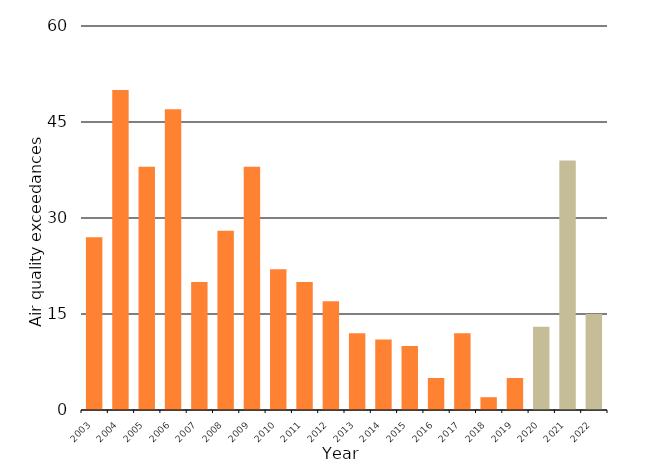
| Category | Air quality exceedances |
|---|---|
| 2003.0 | 27 |
| 2004.0 | 50 |
| 2005.0 | 38 |
| 2006.0 | 47 |
| 2007.0 | 20 |
| 2008.0 | 28 |
| 2009.0 | 38 |
| 2010.0 | 22 |
| 2011.0 | 20 |
| 2012.0 | 17 |
| 2013.0 | 12 |
| 2014.0 | 11 |
| 2015.0 | 10 |
| 2016.0 | 5 |
| 2017.0 | 12 |
| 2018.0 | 2 |
| 2019.0 | 5 |
| 2020.0 | 13 |
| 2021.0 | 39 |
| 2022.0 | 15 |